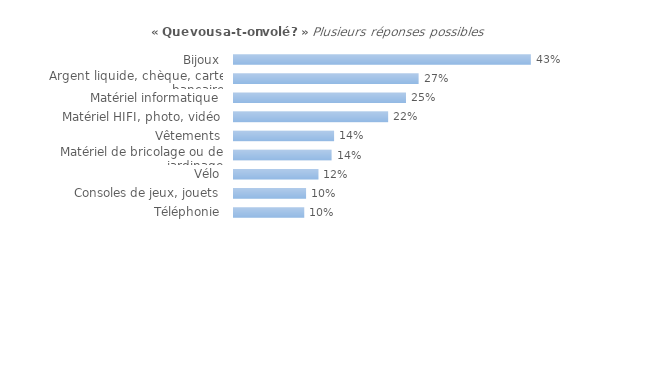
| Category | Series 0 |
|---|---|
| Bijoux | 0.428 |
| Argent liquide, chèque, carte bancaire | 0.266 |
| Matériel informatique | 0.248 |
| Matériel HIFI, photo, vidéo | 0.222 |
| Vêtements | 0.144 |
| Matériel de bricolage ou de jardinage | 0.141 |
| Vélo | 0.122 |
| Consoles de jeux, jouets | 0.104 |
| Téléphonie | 0.101 |